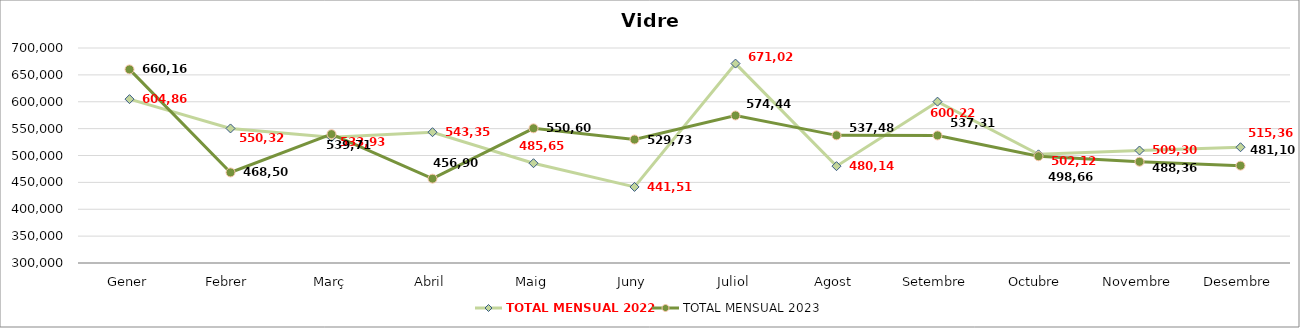
| Category | TOTAL MENSUAL 2022 | TOTAL MENSUAL 2023 |
|---|---|---|
| Gener | 604860.5 | 660164.275 |
| Febrer | 550327.78 | 468502.399 |
| Març | 533936 | 539710.426 |
| Abril | 543358.242 | 456908.05 |
| Maig | 485655.208 | 550602.026 |
| Juny | 441517.641 | 529734.222 |
| Juliol | 671025.044 | 574443.759 |
| Agost | 480146.196 | 537486.323 |
| Setembre | 600221.146 | 537319.413 |
| Octubre | 502126.968 | 498667.93 |
| Novembre | 509309.186 | 488363.65 |
| Desembre | 515359.689 | 481106.445 |